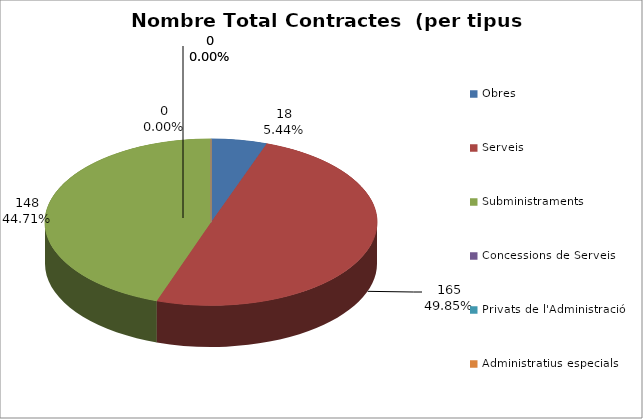
| Category | Nombre Total Contractes |
|---|---|
| Obres | 18 |
| Serveis | 165 |
| Subministraments | 148 |
| Concessions de Serveis | 0 |
| Privats de l'Administració | 0 |
| Administratius especials | 0 |